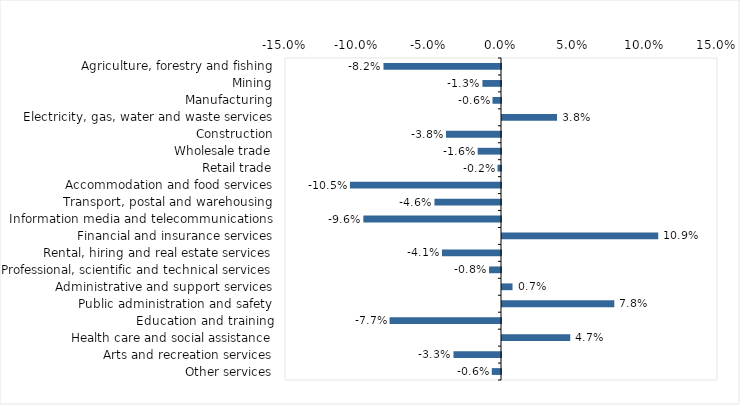
| Category | This week |
|---|---|
| Agriculture, forestry and fishing | -0.082 |
| Mining | -0.013 |
| Manufacturing | -0.006 |
| Electricity, gas, water and waste services | 0.038 |
| Construction | -0.038 |
| Wholesale trade | -0.016 |
| Retail trade | -0.002 |
| Accommodation and food services | -0.105 |
| Transport, postal and warehousing | -0.046 |
| Information media and telecommunications | -0.096 |
| Financial and insurance services | 0.108 |
| Rental, hiring and real estate services | -0.041 |
| Professional, scientific and technical services | -0.008 |
| Administrative and support services | 0.007 |
| Public administration and safety | 0.078 |
| Education and training | -0.077 |
| Health care and social assistance | 0.047 |
| Arts and recreation services | -0.033 |
| Other services | -0.006 |